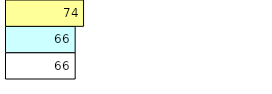
| Category | Total Standouts | Total Recd | Total Tipsters |
|---|---|---|---|
| 0 | 66 | 66 | 74 |